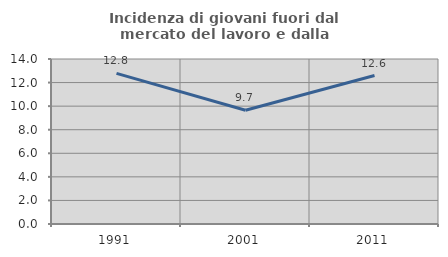
| Category | Incidenza di giovani fuori dal mercato del lavoro e dalla formazione  |
|---|---|
| 1991.0 | 12.782 |
| 2001.0 | 9.655 |
| 2011.0 | 12.598 |